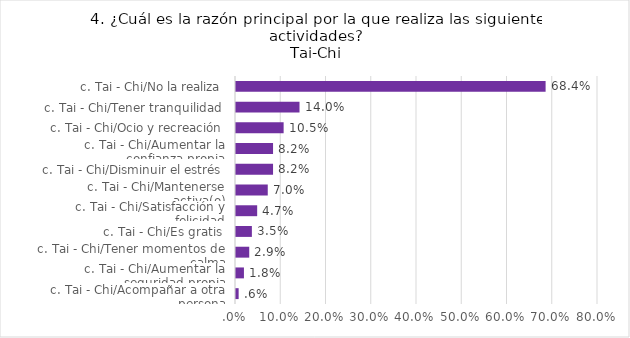
| Category | Series 0 |
|---|---|
| c. Tai - Chi/Acompañar a otra persona | 0.006 |
| c. Tai - Chi/Aumentar la seguridad propia | 0.018 |
| c. Tai - Chi/Tener momentos de calma | 0.029 |
| c. Tai - Chi/Es gratis | 0.035 |
| c. Tai - Chi/Satisfacción y felicidad | 0.047 |
| c. Tai - Chi/Mantenerse activa(o) | 0.07 |
| c. Tai - Chi/Disminuir el estrés | 0.082 |
| c. Tai - Chi/Aumentar la confianza propia | 0.082 |
| c. Tai - Chi/Ocio y recreación | 0.105 |
| c. Tai - Chi/Tener tranquilidad | 0.14 |
| c. Tai - Chi/No la realiza | 0.684 |